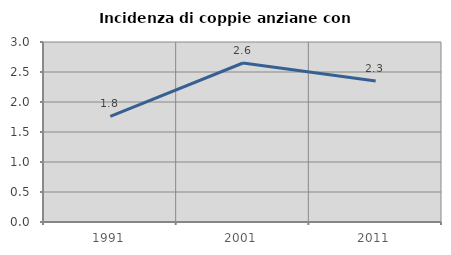
| Category | Incidenza di coppie anziane con figli |
|---|---|
| 1991.0 | 1.761 |
| 2001.0 | 2.65 |
| 2011.0 | 2.349 |